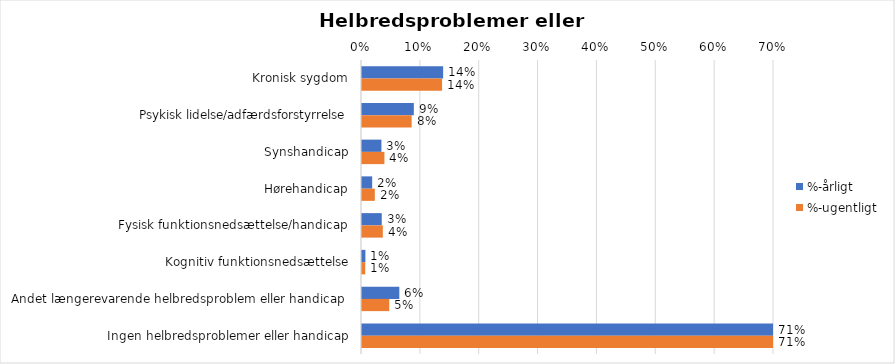
| Category | %-årligt | %-ugentligt |
|---|---|---|
| Kronisk sygdom | 0.138 | 0.136 |
| Psykisk lidelse/adfærdsforstyrrelse | 0.088 | 0.084 |
| Synshandicap | 0.033 | 0.038 |
| Hørehandicap | 0.017 | 0.022 |
| Fysisk funktionsnedsættelse/handicap | 0.034 | 0.035 |
| Kognitiv funktionsnedsættelse | 0.006 | 0.005 |
| Andet længerevarende helbredsproblem eller handicap  | 0.063 | 0.046 |
| Ingen helbredsproblemer eller handicap | 0.705 | 0.709 |